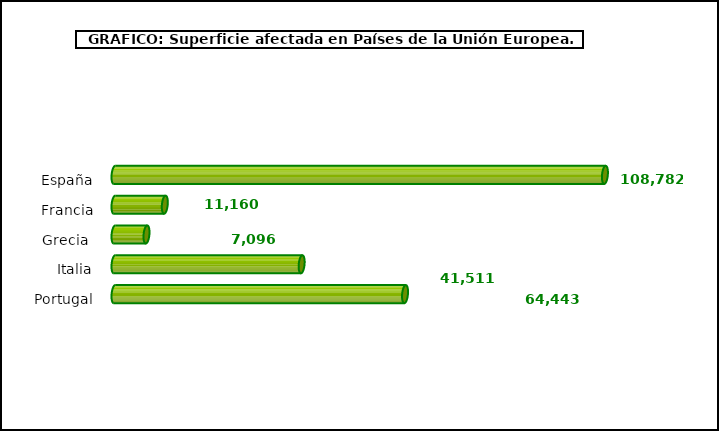
| Category | europa |
|---|---|
| España | 108782 |
| Francia | 11160 |
| Grecia  | 7096 |
| Italia | 41511 |
| Portugal | 64443 |